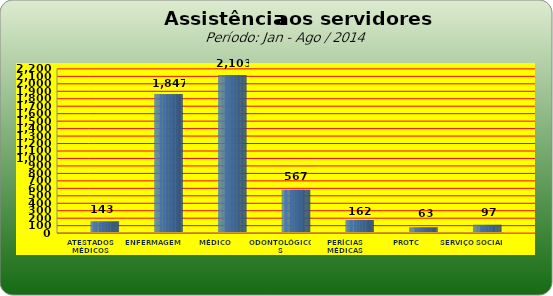
| Category | Series 0 |
|---|---|
| ATESTADOS MÉDICOS | 143 |
| ENFERMAGEM | 1847 |
| MÉDICO | 2103 |
| ODONTOLÓGICOS | 567 |
| PERÍCIAS MÉDICAS | 162 |
| PROTC | 63 |
| SERVIÇO SOCIAL | 97 |